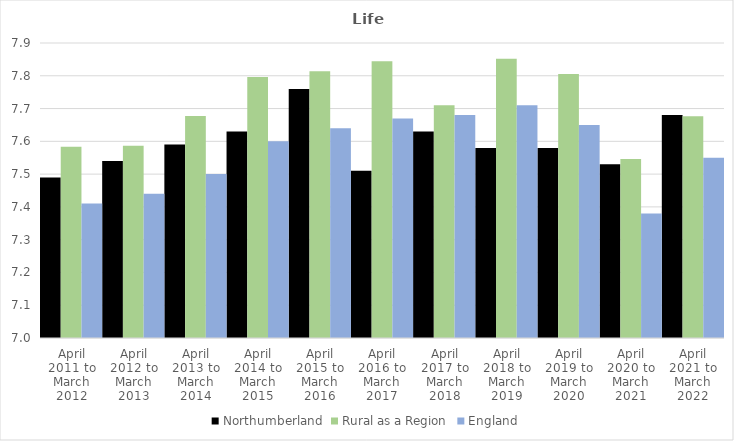
| Category | Northumberland | Rural as a Region | England |
|---|---|---|---|
| April 2011 to March 2012 | 7.49 | 7.584 | 7.41 |
| April 2012 to March 2013 | 7.54 | 7.586 | 7.44 |
| April 2013 to March 2014 | 7.59 | 7.677 | 7.5 |
| April 2014 to March 2015 | 7.63 | 7.797 | 7.6 |
| April 2015 to March 2016 | 7.76 | 7.813 | 7.64 |
| April 2016 to March 2017 | 7.51 | 7.845 | 7.67 |
| April 2017 to March 2018 | 7.63 | 7.71 | 7.68 |
| April 2018 to March 2019 | 7.58 | 7.852 | 7.71 |
| April 2019 to March 2020 | 7.58 | 7.806 | 7.65 |
| April 2020 to March 2021 | 7.53 | 7.546 | 7.38 |
| April 2021 to March 2022 | 7.68 | 7.677 | 7.55 |